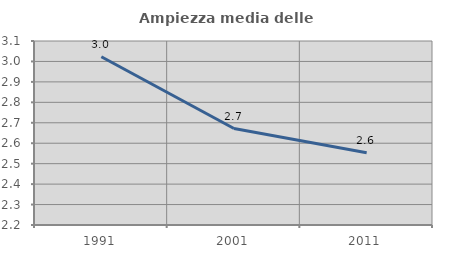
| Category | Ampiezza media delle famiglie |
|---|---|
| 1991.0 | 3.023 |
| 2001.0 | 2.672 |
| 2011.0 | 2.554 |